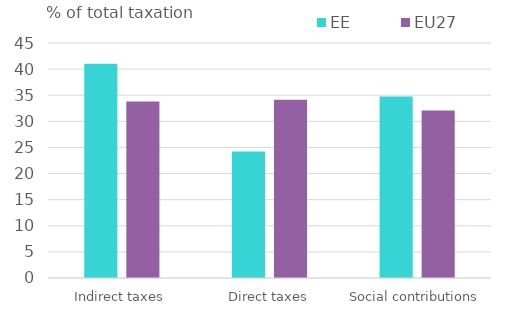
| Category | EE | EU27 |
|---|---|---|
| Indirect taxes | 41.007 | 33.811 |
| Direct taxes | 24.243 | 34.133 |
| Social contributions | 34.751 | 32.056 |